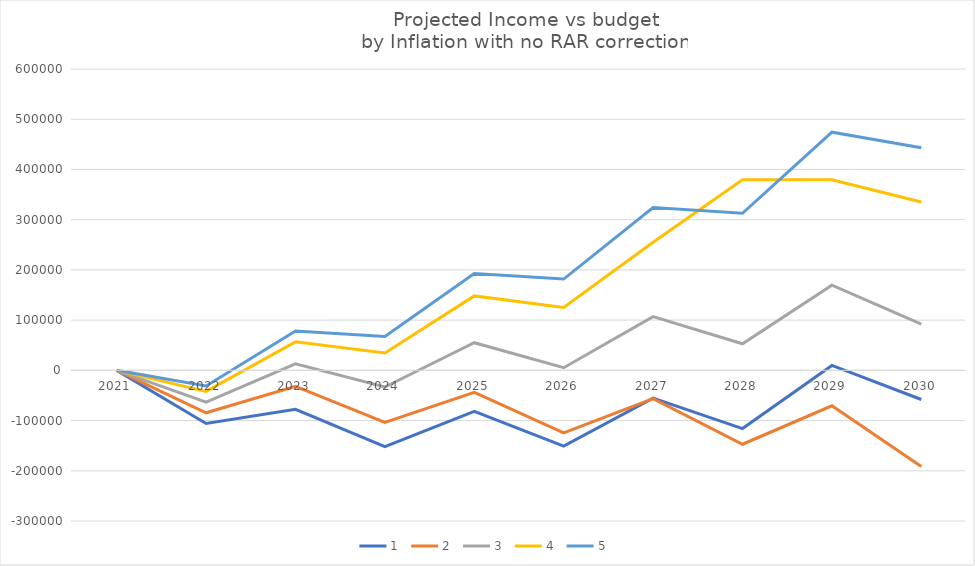
| Category | 1 | 2 | 3 | 4 | 5 |
|---|---|---|---|---|---|
| 2021.0 | -10.911 | -10.911 | -10.911 | -10.911 | -10.911 |
| 2022.0 | -105872.407 | -84555.287 | -63238.167 | -41921.047 | -31262.487 |
| 2023.0 | -77517.281 | -31898.644 | 12867.308 | 56780.575 | 78417.452 |
| 2024.0 | -152110.147 | -103754.392 | -33245.886 | 34602.243 | 67544.655 |
| 2025.0 | -81788.535 | -43709.508 | 55008.37 | 148192.323 | 192775.107 |
| 2026.0 | -150973.419 | -124446.626 | 5132.339 | 125117.986 | 181683.767 |
| 2027.0 | -55494.35 | -56433.602 | 106855.637 | 255176.534 | 324075.884 |
| 2028.0 | -115934.265 | -147149.828 | 52909.723 | 379459.031 | 312761.607 |
| 2029.0 | 9698.309 | -70533.321 | 169581.678 | 379459.031 | 474109.895 |
| 2030.0 | -58074.873 | -191677.828 | 92018.022 | 335266.873 | 443352.447 |